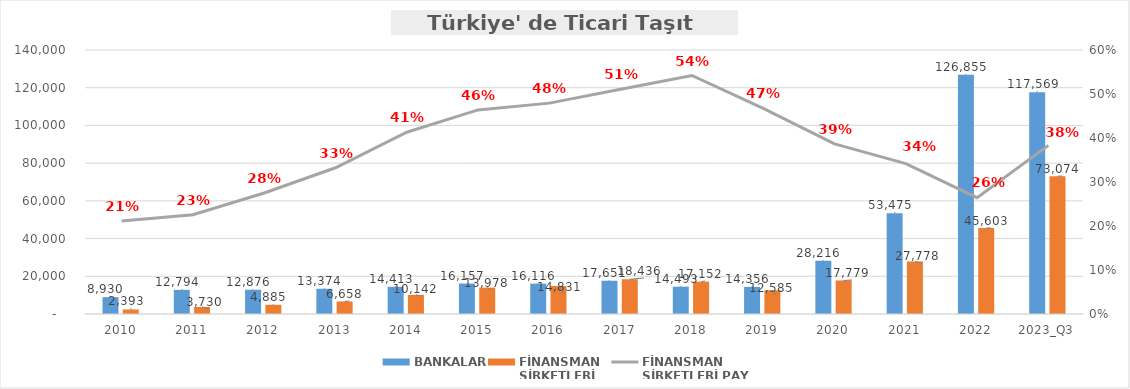
| Category | BANKALAR | FİNANSMAN 
ŞİRKETLERİ |
|---|---|---|
| 2010 | 8930.131 | 2392.721 |
| 2011 | 12793.723 | 3729.987 |
| 2012 | 12876.346 | 4885.495 |
| 2013 | 13374.424 | 6657.806 |
| 2014 | 14412.767 | 10141.887 |
| 2015 | 16157.225 | 13978.426 |
| 2016 | 16116.463 | 14831.249 |
| 2017 | 17650.963 | 18436.034 |
| 2018 | 14492.83 | 17152.034 |
| 2019 | 14355.978 | 12584.792 |
| 2020 | 28216.157 | 17779.072 |
| 2021 | 53475.488 | 27778.353 |
| 2022 | 126855.404 | 45602.871 |
| 2023_Q3 | 117568.564 | 73074.399 |